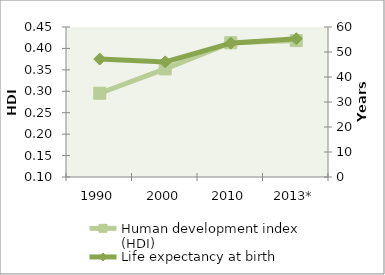
| Category | Human development index (HDI) |
|---|---|
| 1990 | 0.295 |
| 2000 | 0.352 |
| 2010 | 0.413 |
| 2013* | 0.418 |